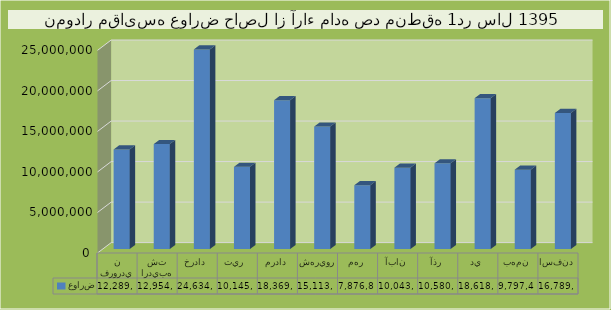
| Category | عوارض |
|---|---|
| فروردين | 12289209 |
| ارديبهشت | 12954131 |
| خرداد | 24634566 |
| تير  | 10145201 |
| مرداد | 18369636 |
| شهريور | 15113454 |
| مهر | 7876822 |
| آبان | 10043370 |
| آذر | 10580574 |
| دي | 18618759 |
| بهمن | 9797429 |
| اسفند | 16789401 |